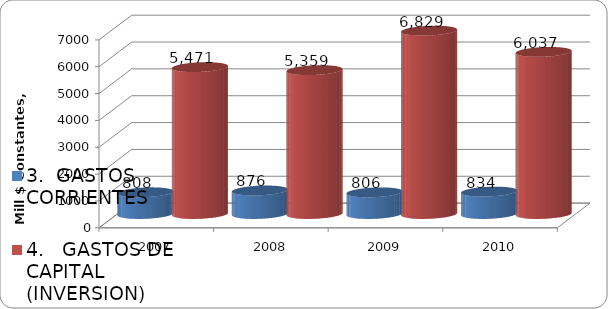
| Category | 3.  GASTOS CORRIENTES | 4.   GASTOS DE CAPITAL (INVERSION) |
|---|---|---|
| 2007 | 808.152 | 5470.705 |
| 2008 | 876.479 | 5358.774 |
| 2009 | 806.469 | 6829.111 |
| 2010 | 834.295 | 6037.469 |